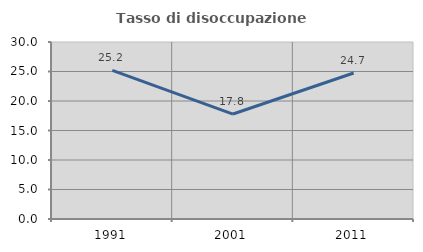
| Category | Tasso di disoccupazione giovanile  |
|---|---|
| 1991.0 | 25.183 |
| 2001.0 | 17.79 |
| 2011.0 | 24.744 |